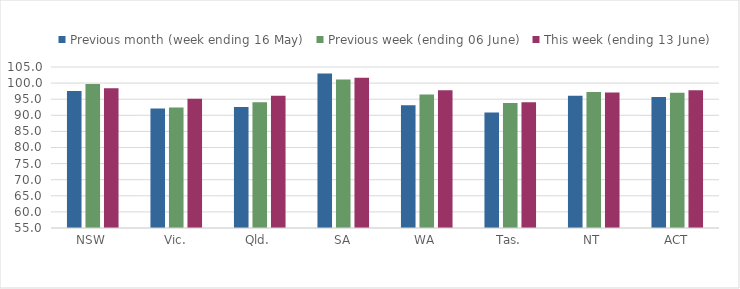
| Category | Previous month (week ending 16 May) | Previous week (ending 06 June) | This week (ending 13 June) |
|---|---|---|---|
| NSW | 97.563 | 99.759 | 98.415 |
| Vic. | 92.079 | 92.439 | 95.145 |
| Qld. | 92.594 | 94.056 | 96.06 |
| SA | 102.971 | 101.145 | 101.675 |
| WA | 93.118 | 96.449 | 97.743 |
| Tas. | 90.878 | 93.788 | 94.079 |
| NT | 96.102 | 97.236 | 97.066 |
| ACT | 95.655 | 96.987 | 97.807 |